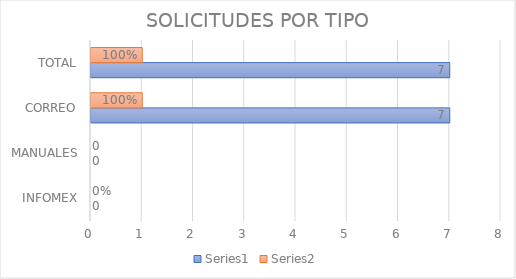
| Category | Series 0 | Series 1 |
|---|---|---|
| INFOMEX | 0 | 0 |
| MANUALES | 0 | 0 |
| CORREO | 7 | 1 |
| TOTAL | 7 | 1 |